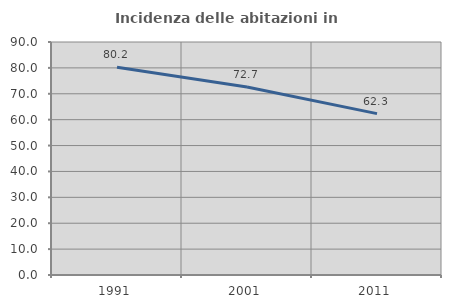
| Category | Incidenza delle abitazioni in proprietà  |
|---|---|
| 1991.0 | 80.245 |
| 2001.0 | 72.65 |
| 2011.0 | 62.339 |